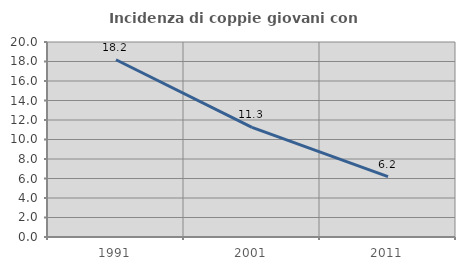
| Category | Incidenza di coppie giovani con figli |
|---|---|
| 1991.0 | 18.182 |
| 2001.0 | 11.251 |
| 2011.0 | 6.187 |